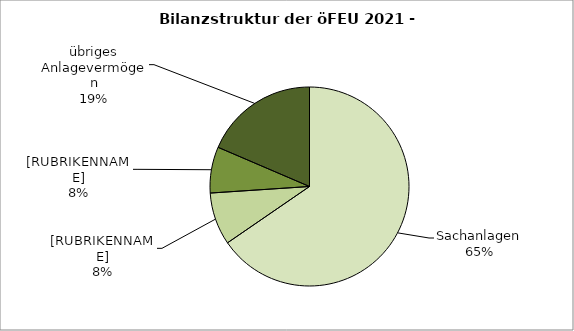
| Category | Series 0 |
|---|---|
| Sachanlagen | 65.419 |
| übriges Umlaufvermögen übrige Aktiva | 8.53 |
| Forderungen | 7.496 |
| übriges Anlagevermögen | 18.555 |